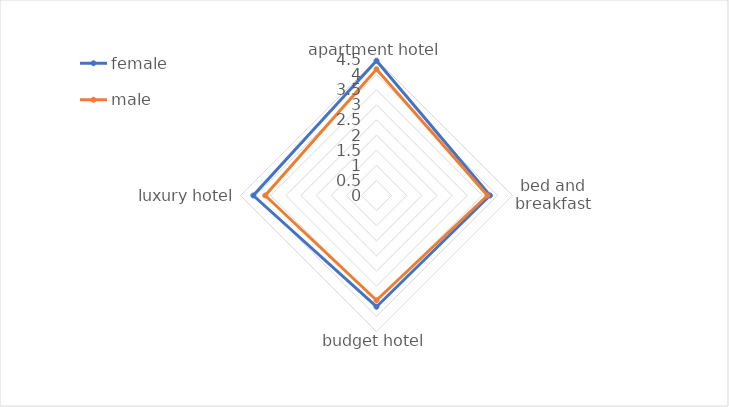
| Category | female | male |
|---|---|---|
| apartment hotel | 4.462 | 4.179 |
| bed and breakfast | 3.756 | 3.671 |
| budget hotel | 3.68 | 3.466 |
| luxury hotel | 4.077 | 3.682 |